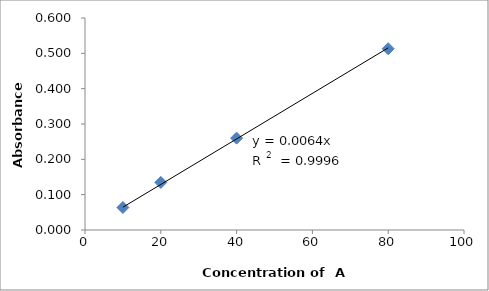
| Category | Series 0 |
|---|---|
| 10.0 | 0.064 |
| 20.0 | 0.135 |
| 40.0 | 0.26 |
| 80.0 | 0.513 |